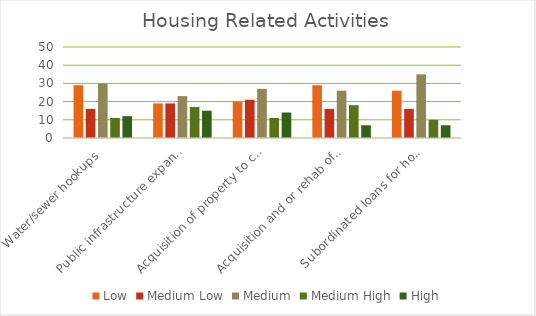
| Category | Low | Medium Low | Medium | Medium High | High |
|---|---|---|---|---|---|
| Water/sewer hookups | 29 | 16 | 30 | 11 | 12 |
| Public infrastructure expansion | 19 | 19 | 23 | 17 | 15 |
| Acquisition of property to construct | 20 | 21 | 27 | 11 | 14 |
| Acquisition and or rehab of existing | 29 | 16 | 26 | 18 | 7 |
| Subordinated loans for homeownership | 26 | 16 | 35 | 10 | 7 |